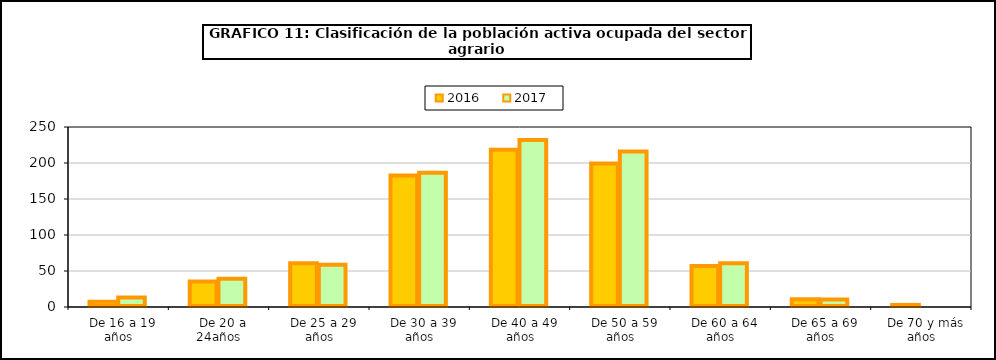
| Category | 2016 | 2017 |
|---|---|---|
|   De 16 a 19 años | 7.3 | 13.1 |
|   De 20 a 24años | 35.5 | 39.1 |
|   De 25 a 29 años | 60.9 | 58.8 |
|   De 30 a 39 años | 182.7 | 186.6 |
|   De 40 a 49 años | 218.5 | 232 |
|   De 50 a 59 años | 199.3 | 215.9 |
|   De 60 a 64 años | 56.8 | 60.9 |
|   De 65 a 69 años | 10.8 | 10.5 |
|   De 70 y más años | 2.9 | 0 |